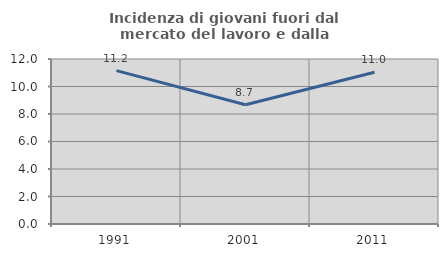
| Category | Incidenza di giovani fuori dal mercato del lavoro e dalla formazione  |
|---|---|
| 1991.0 | 11.151 |
| 2001.0 | 8.677 |
| 2011.0 | 11.033 |